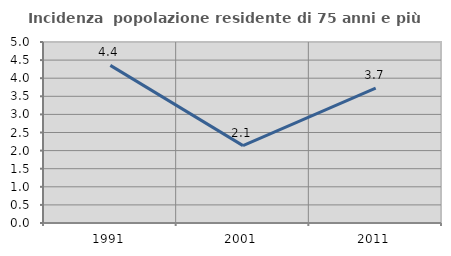
| Category | Incidenza  popolazione residente di 75 anni e più |
|---|---|
| 1991.0 | 4.354 |
| 2001.0 | 2.138 |
| 2011.0 | 3.723 |